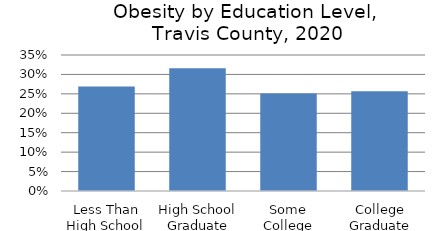
| Category | Series 0 |
|---|---|
| Less Than High School | 0.269 |
| High School Graduate | 0.316 |
| Some College | 0.251 |
| College Graduate | 0.257 |